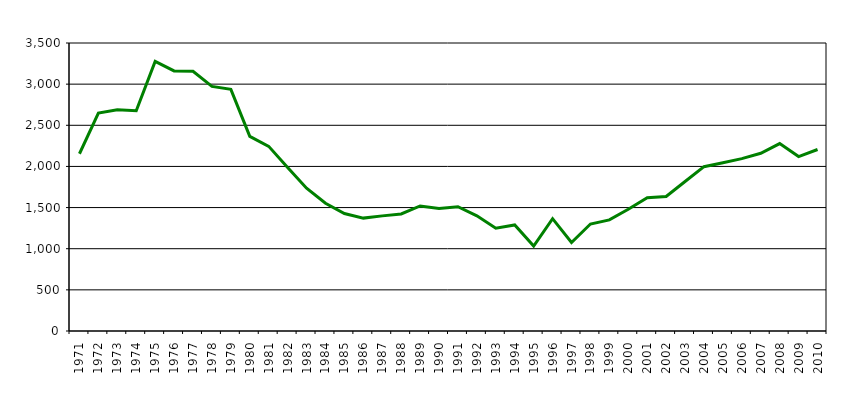
| Category | Series 1 |
|---|---|
| 1971.0 | 2154 |
| 1972.0 | 2648 |
| 1973.0 | 2690 |
| 1974.0 | 2676 |
| 1975.0 | 3276 |
| 1976.0 | 3161 |
| 1977.0 | 3156 |
| 1978.0 | 2973 |
| 1979.0 | 2937 |
| 1980.0 | 2365 |
| 1981.0 | 2244 |
| 1982.0 | 1988 |
| 1983.0 | 1736 |
| 1984.0 | 1553 |
| 1985.0 | 1428 |
| 1986.0 | 1372 |
| 1987.0 | 1399 |
| 1988.0 | 1423 |
| 1989.0 | 1520 |
| 1990.0 | 1488 |
| 1991.0 | 1511 |
| 1992.0 | 1400 |
| 1993.0 | 1250 |
| 1994.0 | 1289 |
| 1995.0 | 1033 |
| 1996.0 | 1365 |
| 1997.0 | 1075 |
| 1998.0 | 1300 |
| 1999.0 | 1350 |
| 2000.0 | 1480 |
| 2001.0 | 1620 |
| 2002.0 | 1635 |
| 2003.0 | 1817 |
| 2004.0 | 1997 |
| 2005.0 | 2045 |
| 2006.0 | 2095 |
| 2007.0 | 2160 |
| 2008.0 | 2278 |
| 2009.0 | 2120 |
| 2010.0 | 2206 |